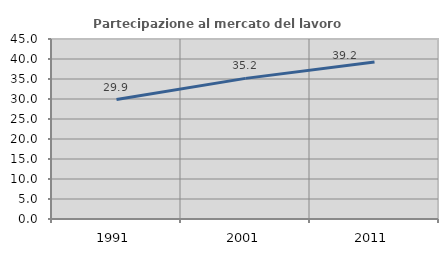
| Category | Partecipazione al mercato del lavoro  femminile |
|---|---|
| 1991.0 | 29.862 |
| 2001.0 | 35.155 |
| 2011.0 | 39.233 |